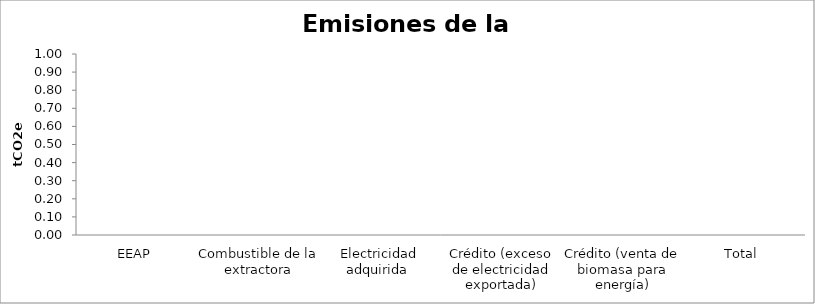
| Category | tCO2e |
|---|---|
| EEAP | 0 |
| Combustible de la extractora | 0 |
| Electricidad adquirida  | 0 |
| Crédito (exceso de electricidad exportada) | 0 |
| Crédito (venta de biomasa para energía) | 0 |
| Total  | 0 |